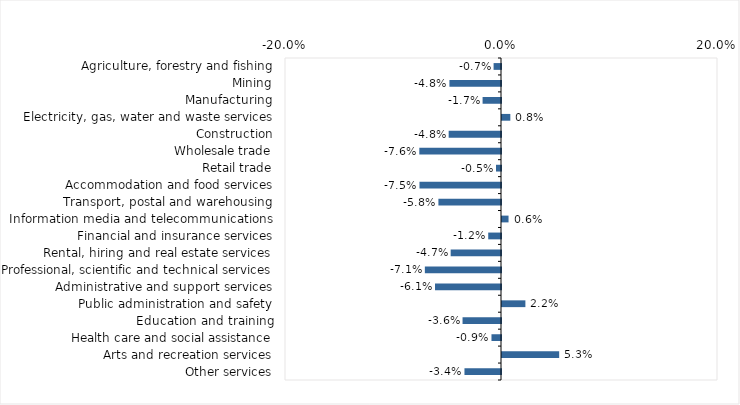
| Category | This week |
|---|---|
| Agriculture, forestry and fishing | -0.007 |
| Mining | -0.048 |
| Manufacturing | -0.017 |
| Electricity, gas, water and waste services | 0.008 |
| Construction | -0.048 |
| Wholesale trade | -0.076 |
| Retail trade | -0.005 |
| Accommodation and food services | -0.075 |
| Transport, postal and warehousing | -0.058 |
| Information media and telecommunications | 0.006 |
| Financial and insurance services | -0.012 |
| Rental, hiring and real estate services | -0.047 |
| Professional, scientific and technical services | -0.071 |
| Administrative and support services | -0.061 |
| Public administration and safety | 0.022 |
| Education and training | -0.036 |
| Health care and social assistance | -0.009 |
| Arts and recreation services | 0.053 |
| Other services | -0.034 |